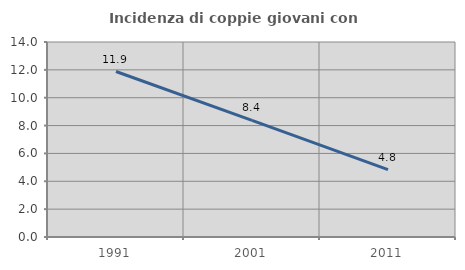
| Category | Incidenza di coppie giovani con figli |
|---|---|
| 1991.0 | 11.881 |
| 2001.0 | 8.372 |
| 2011.0 | 4.831 |